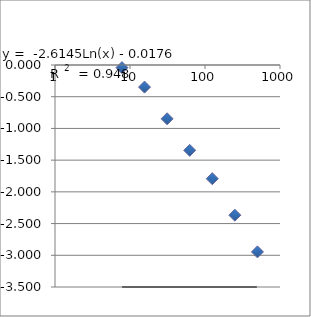
| Category | Series 0 |
|---|---|
| 500.0 | -2.946 |
| 250.0 | -2.368 |
| 125.0 | -1.793 |
| 62.5 | -1.346 |
| 31.25 | -0.848 |
| 15.625 | -0.348 |
| 7.8125 | -0.041 |